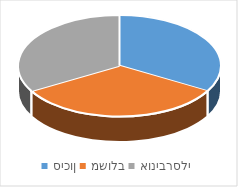
| Category | Series 0 |
|---|---|
| סיכון | 3 |
| משולב | 3 |
| אוניברסלי | 3 |